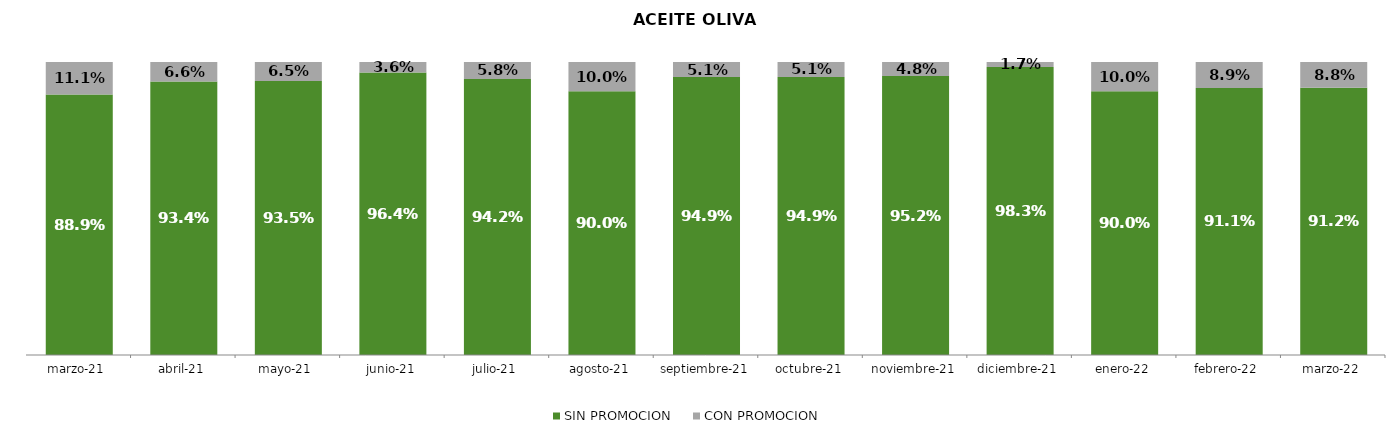
| Category | SIN PROMOCION   | CON PROMOCION   |
|---|---|---|
| 2021-03-01 | 0.889 | 0.111 |
| 2021-04-01 | 0.934 | 0.066 |
| 2021-05-01 | 0.935 | 0.065 |
| 2021-06-01 | 0.964 | 0.036 |
| 2021-07-01 | 0.942 | 0.058 |
| 2021-08-01 | 0.9 | 0.1 |
| 2021-09-01 | 0.949 | 0.051 |
| 2021-10-01 | 0.949 | 0.051 |
| 2021-11-01 | 0.952 | 0.048 |
| 2021-12-01 | 0.983 | 0.017 |
| 2022-01-01 | 0.9 | 0.1 |
| 2022-02-01 | 0.911 | 0.089 |
| 2022-03-01 | 0.912 | 0.088 |